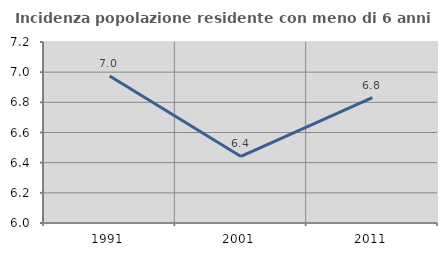
| Category | Incidenza popolazione residente con meno di 6 anni |
|---|---|
| 1991.0 | 6.975 |
| 2001.0 | 6.441 |
| 2011.0 | 6.831 |